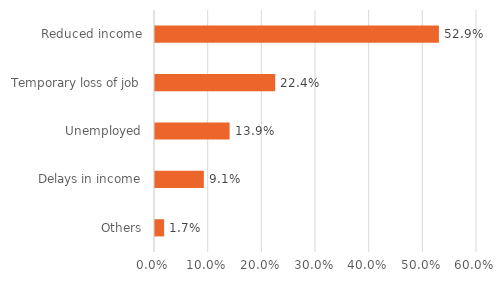
| Category | Series 0 |
|---|---|
| Others | 0.017 |
| Delays in income | 0.091 |
| Unemployed | 0.139 |
| Temporary loss of job | 0.224 |
| Reduced income | 0.529 |